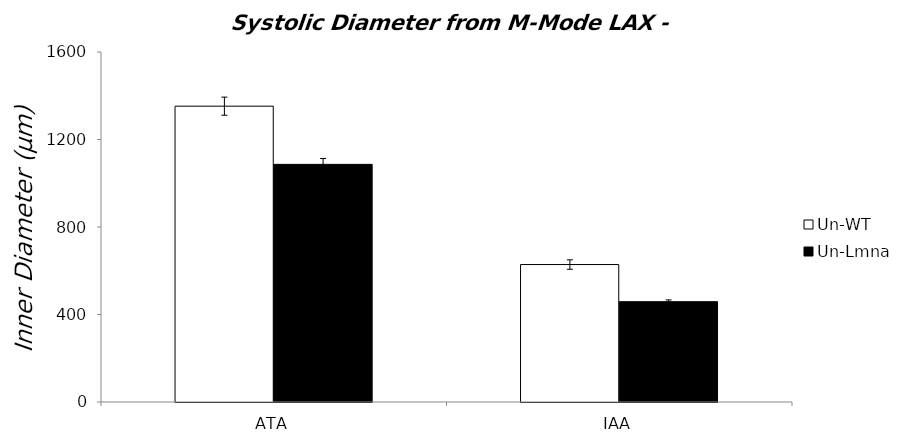
| Category | Un-WT | Un-Lmna |
|---|---|---|
| 0 | 1352.325 | 1086.348 |
| 1 | 628.4 | 458.61 |